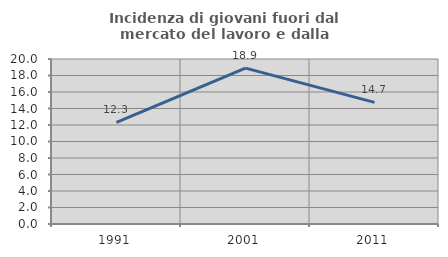
| Category | Incidenza di giovani fuori dal mercato del lavoro e dalla formazione  |
|---|---|
| 1991.0 | 12.306 |
| 2001.0 | 18.899 |
| 2011.0 | 14.739 |